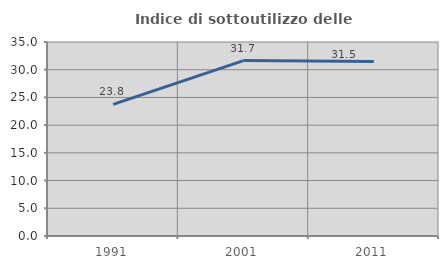
| Category | Indice di sottoutilizzo delle abitazioni  |
|---|---|
| 1991.0 | 23.758 |
| 2001.0 | 31.651 |
| 2011.0 | 31.5 |